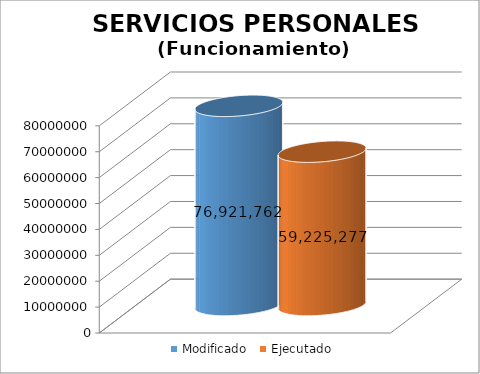
| Category | Modificado | Ejecutado |
|---|---|---|
| 0 | 76921762 | 59225277.09 |